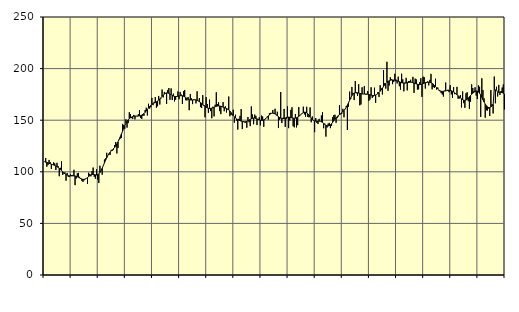
| Category | Piggar | Series 1 |
|---|---|---|
| nan | 110 | 109.69 |
| 87.0 | 113.3 | 109.31 |
| 87.0 | 104.9 | 109.14 |
| 87.0 | 106.5 | 108.66 |
| 87.0 | 111.5 | 108.25 |
| 87.0 | 109.3 | 107.81 |
| 87.0 | 102.8 | 107.39 |
| 87.0 | 107.2 | 106.99 |
| 87.0 | 109.1 | 106.58 |
| 87.0 | 108.2 | 106.17 |
| 87.0 | 101.7 | 105.67 |
| 87.0 | 108.7 | 105.05 |
| nan | 105.5 | 104.28 |
| 88.0 | 95.7 | 103.35 |
| 88.0 | 103.9 | 102.3 |
| 88.0 | 110.1 | 101.17 |
| 88.0 | 96.9 | 100.05 |
| 88.0 | 98.2 | 99.02 |
| 88.0 | 99.5 | 98.13 |
| 88.0 | 91.4 | 97.4 |
| 88.0 | 98.9 | 96.8 |
| 88.0 | 95.2 | 96.35 |
| 88.0 | 95 | 96.08 |
| 88.0 | 97.5 | 95.99 |
| nan | 96.8 | 96 |
| 89.0 | 97 | 96.06 |
| 89.0 | 101.9 | 96.09 |
| 89.0 | 87.1 | 95.98 |
| 89.0 | 93.5 | 95.68 |
| 89.0 | 98.5 | 95.24 |
| 89.0 | 98.9 | 94.67 |
| 89.0 | 95.1 | 94.05 |
| 89.0 | 94 | 93.43 |
| 89.0 | 91.3 | 92.92 |
| 89.0 | 90.2 | 92.65 |
| 89.0 | 91.8 | 92.66 |
| nan | 93.2 | 92.97 |
| 90.0 | 93.7 | 93.6 |
| 90.0 | 88.2 | 94.44 |
| 90.0 | 99.1 | 95.36 |
| 90.0 | 97.9 | 96.26 |
| 90.0 | 95.6 | 96.98 |
| 90.0 | 100.7 | 97.37 |
| 90.0 | 104.1 | 97.44 |
| 90.0 | 95.2 | 97.27 |
| 90.0 | 93.4 | 97.02 |
| 90.0 | 102.5 | 96.93 |
| 90.0 | 92.4 | 97.18 |
| nan | 89.1 | 97.92 |
| 91.0 | 105.9 | 99.22 |
| 91.0 | 100.7 | 101.09 |
| 91.0 | 97.2 | 103.42 |
| 91.0 | 105.7 | 105.98 |
| 91.0 | 111.9 | 108.64 |
| 91.0 | 113.1 | 111.24 |
| 91.0 | 118.4 | 113.63 |
| 91.0 | 115.6 | 115.73 |
| 91.0 | 116.9 | 117.53 |
| 91.0 | 116.3 | 119.01 |
| 91.0 | 121.3 | 120.2 |
| nan | 120.4 | 121.29 |
| 92.0 | 121.4 | 122.36 |
| 92.0 | 125.9 | 123.57 |
| 92.0 | 128.9 | 125.08 |
| 92.0 | 117.8 | 126.91 |
| 92.0 | 123.1 | 128.99 |
| 92.0 | 130.9 | 131.31 |
| 92.0 | 132.2 | 133.83 |
| 92.0 | 132.9 | 136.5 |
| 92.0 | 146.4 | 139.25 |
| 92.0 | 145.4 | 141.99 |
| 92.0 | 141.6 | 144.59 |
| nan | 150.9 | 146.9 |
| 93.0 | 142.8 | 148.83 |
| 93.0 | 147.2 | 150.36 |
| 93.0 | 157.7 | 151.51 |
| 93.0 | 155.8 | 152.37 |
| 93.0 | 152 | 153.02 |
| 93.0 | 151.3 | 153.5 |
| 93.0 | 155.1 | 153.79 |
| 93.0 | 150.8 | 153.97 |
| 93.0 | 154.1 | 154.03 |
| 93.0 | 153.6 | 154.02 |
| 93.0 | 155.8 | 154.05 |
| nan | 159.7 | 154.18 |
| 94.0 | 152.1 | 154.46 |
| 94.0 | 151.2 | 154.95 |
| 94.0 | 154.3 | 155.61 |
| 94.0 | 154.4 | 156.47 |
| 94.0 | 159.9 | 157.58 |
| 94.0 | 162.1 | 158.9 |
| 94.0 | 154.6 | 160.36 |
| 94.0 | 165.9 | 161.85 |
| 94.0 | 161.3 | 163.23 |
| 94.0 | 162.6 | 164.41 |
| 94.0 | 171.6 | 165.34 |
| nan | 164.6 | 166.05 |
| 95.0 | 167.8 | 166.64 |
| 95.0 | 172.4 | 167.22 |
| 95.0 | 162.1 | 167.85 |
| 95.0 | 163.5 | 168.61 |
| 95.0 | 173.5 | 169.51 |
| 95.0 | 165.2 | 170.56 |
| 95.0 | 171 | 171.75 |
| 95.0 | 179.7 | 173.03 |
| 95.0 | 172.1 | 174.28 |
| 95.0 | 177.4 | 175.36 |
| 95.0 | 175.8 | 176.12 |
| nan | 165.8 | 176.46 |
| 96.0 | 179.3 | 176.4 |
| 96.0 | 181.2 | 175.98 |
| 96.0 | 169.8 | 175.37 |
| 96.0 | 180.8 | 174.71 |
| 96.0 | 169.6 | 174.04 |
| 96.0 | 175.7 | 173.46 |
| 96.0 | 168.2 | 173.09 |
| 96.0 | 169.8 | 172.92 |
| 96.0 | 173.3 | 172.98 |
| 96.0 | 177.9 | 173.2 |
| 96.0 | 170.3 | 173.47 |
| nan | 177.4 | 173.7 |
| 97.0 | 174.9 | 173.78 |
| 97.0 | 165.7 | 173.62 |
| 97.0 | 178.2 | 173.23 |
| 97.0 | 179.3 | 172.62 |
| 97.0 | 169.3 | 171.84 |
| 97.0 | 169.2 | 171.04 |
| 97.0 | 172.5 | 170.33 |
| 97.0 | 159.7 | 169.86 |
| 97.0 | 175.4 | 169.6 |
| 97.0 | 171.1 | 169.52 |
| 97.0 | 165.6 | 169.61 |
| nan | 170.3 | 169.74 |
| 98.0 | 170 | 169.78 |
| 98.0 | 166.3 | 169.68 |
| 98.0 | 178 | 169.33 |
| 98.0 | 168.5 | 168.71 |
| 98.0 | 171.5 | 167.92 |
| 98.0 | 162.7 | 167.06 |
| 98.0 | 161.8 | 166.2 |
| 98.0 | 174.3 | 165.35 |
| 98.0 | 163.7 | 164.47 |
| 98.0 | 152.8 | 163.54 |
| 98.0 | 172.3 | 162.66 |
| nan | 165.7 | 161.95 |
| 99.0 | 157.2 | 161.52 |
| 99.0 | 169.9 | 161.37 |
| 99.0 | 158.8 | 161.44 |
| 99.0 | 151.9 | 161.66 |
| 99.0 | 163.1 | 162.03 |
| 99.0 | 153.7 | 162.5 |
| 99.0 | 165 | 163.03 |
| 99.0 | 177 | 163.44 |
| 99.0 | 165.6 | 163.7 |
| 99.0 | 167.4 | 163.82 |
| 99.0 | 158.8 | 163.78 |
| nan | 155.9 | 163.52 |
| 0.0 | 163.2 | 163.13 |
| 0.0 | 167.5 | 162.66 |
| 0.0 | 158.7 | 162.16 |
| 0.0 | 163.4 | 161.73 |
| 0.0 | 157.5 | 161.34 |
| 0.0 | 160.4 | 160.82 |
| 0.0 | 172.9 | 160.01 |
| 0.0 | 153.8 | 158.86 |
| 0.0 | 155.1 | 157.44 |
| 0.0 | 154.9 | 155.93 |
| 0.0 | 160.1 | 154.46 |
| nan | 147.6 | 153.18 |
| 1.0 | 155.3 | 152.12 |
| 1.0 | 149.6 | 151.25 |
| 1.0 | 140.9 | 150.58 |
| 1.0 | 151.4 | 150.04 |
| 1.0 | 154.2 | 149.56 |
| 1.0 | 160.8 | 149.16 |
| 1.0 | 141.4 | 148.8 |
| 1.0 | 149.1 | 148.51 |
| 1.0 | 147.9 | 148.44 |
| 1.0 | 147.5 | 148.58 |
| 1.0 | 142.7 | 148.91 |
| nan | 153.1 | 149.42 |
| 2.0 | 148 | 150.06 |
| 2.0 | 144.3 | 150.72 |
| 2.0 | 163.3 | 151.37 |
| 2.0 | 155.5 | 151.89 |
| 2.0 | 146.1 | 152.13 |
| 2.0 | 155.4 | 152.06 |
| 2.0 | 154.2 | 151.73 |
| 2.0 | 145.3 | 151.26 |
| 2.0 | 150.4 | 150.72 |
| 2.0 | 152.8 | 150.22 |
| 2.0 | 145 | 149.87 |
| nan | 154.5 | 149.76 |
| 3.0 | 153.6 | 149.89 |
| 3.0 | 143.6 | 150.3 |
| 3.0 | 150.7 | 150.96 |
| 3.0 | 152.1 | 151.83 |
| 3.0 | 153.4 | 152.92 |
| 3.0 | 150.6 | 154.09 |
| 3.0 | 156.8 | 155.19 |
| 3.0 | 157.1 | 156.11 |
| 3.0 | 156.4 | 156.69 |
| 3.0 | 159.9 | 156.87 |
| 3.0 | 156.2 | 156.67 |
| nan | 161.1 | 156.09 |
| 4.0 | 154.9 | 155.23 |
| 4.0 | 158.2 | 154.3 |
| 4.0 | 142.4 | 153.41 |
| 4.0 | 150.4 | 152.57 |
| 4.0 | 177.3 | 151.94 |
| 4.0 | 147.2 | 151.6 |
| 4.0 | 152.4 | 151.54 |
| 4.0 | 160.9 | 151.75 |
| 4.0 | 143.5 | 152.16 |
| 4.0 | 151.3 | 152.6 |
| 4.0 | 163.4 | 152.9 |
| nan | 142.3 | 153 |
| 5.0 | 149.7 | 152.88 |
| 5.0 | 160 | 152.6 |
| 5.0 | 162.5 | 152.27 |
| 5.0 | 144.2 | 152.04 |
| 5.0 | 143.1 | 151.94 |
| 5.0 | 156 | 152.03 |
| 5.0 | 143 | 152.4 |
| 5.0 | 145.2 | 152.97 |
| 5.0 | 162.7 | 153.74 |
| 5.0 | 155 | 154.69 |
| 5.0 | 155.6 | 155.66 |
| nan | 156.3 | 156.59 |
| 6.0 | 163.1 | 157.37 |
| 6.0 | 155.6 | 157.76 |
| 6.0 | 153.3 | 157.67 |
| 6.0 | 163 | 157.11 |
| 6.0 | 153.1 | 156.18 |
| 6.0 | 152.8 | 154.92 |
| 6.0 | 162.4 | 153.47 |
| 6.0 | 148 | 152.05 |
| 6.0 | 153.6 | 150.79 |
| 6.0 | 150 | 149.83 |
| 6.0 | 138.4 | 149.27 |
| nan | 152.1 | 149.03 |
| 7.0 | 147.4 | 148.99 |
| 7.0 | 146.3 | 149.04 |
| 7.0 | 151.3 | 149.06 |
| 7.0 | 148.9 | 148.91 |
| 7.0 | 154.7 | 148.46 |
| 7.0 | 157.7 | 147.75 |
| 7.0 | 142.2 | 146.86 |
| 7.0 | 146.7 | 145.92 |
| 7.0 | 134.1 | 145.14 |
| 7.0 | 142.9 | 144.59 |
| 7.0 | 146.7 | 144.43 |
| nan | 147.4 | 144.74 |
| 8.0 | 142.3 | 145.47 |
| 8.0 | 144.4 | 146.62 |
| 8.0 | 152.9 | 148.05 |
| 8.0 | 154.9 | 149.57 |
| 8.0 | 155.3 | 151.02 |
| 8.0 | 147.5 | 152.32 |
| 8.0 | 152 | 153.44 |
| 8.0 | 153.6 | 154.48 |
| 8.0 | 164.5 | 155.41 |
| 8.0 | 155.6 | 156.31 |
| 8.0 | 156 | 157.23 |
| nan | 161 | 158.23 |
| 9.0 | 152.8 | 159.41 |
| 9.0 | 160.7 | 160.87 |
| 9.0 | 163.7 | 162.59 |
| 9.0 | 140.5 | 164.6 |
| 9.0 | 163.2 | 166.92 |
| 9.0 | 177.7 | 169.38 |
| 9.0 | 170.6 | 171.76 |
| 9.0 | 182.2 | 173.79 |
| 9.0 | 176.5 | 175.3 |
| 9.0 | 169.5 | 176.24 |
| 9.0 | 187.9 | 176.68 |
| nan | 176 | 176.74 |
| 10.0 | 173.6 | 176.57 |
| 10.0 | 184.9 | 176.28 |
| 10.0 | 164.4 | 175.94 |
| 10.0 | 165.3 | 175.65 |
| 10.0 | 181.9 | 175.44 |
| 10.0 | 175.3 | 175.37 |
| 10.0 | 183 | 175.38 |
| 10.0 | 175 | 175.39 |
| 10.0 | 174.9 | 175.35 |
| 10.0 | 178.3 | 175.22 |
| 10.0 | 168.7 | 174.95 |
| nan | 170 | 174.57 |
| 11.0 | 181.9 | 174.23 |
| 11.0 | 171.5 | 173.99 |
| 11.0 | 173 | 173.94 |
| 11.0 | 181.5 | 174.09 |
| 11.0 | 166.8 | 174.44 |
| 11.0 | 175 | 175 |
| 11.0 | 177.3 | 175.79 |
| 11.0 | 172.5 | 176.8 |
| 11.0 | 183.9 | 178.05 |
| 11.0 | 180.7 | 179.51 |
| 11.0 | 174.9 | 181.08 |
| nan | 198.5 | 182.67 |
| 12.0 | 185.9 | 184.17 |
| 12.0 | 180.6 | 185.47 |
| 12.0 | 206.6 | 186.59 |
| 12.0 | 178.5 | 187.53 |
| 12.0 | 183.6 | 188.22 |
| 12.0 | 191.6 | 188.68 |
| 12.0 | 189.6 | 188.93 |
| 12.0 | 184.9 | 188.99 |
| 12.0 | 187 | 188.89 |
| 12.0 | 195 | 188.68 |
| 12.0 | 189.4 | 188.41 |
| nan | 185.6 | 188.12 |
| 13.0 | 192.2 | 187.75 |
| 13.0 | 182.9 | 187.31 |
| 13.0 | 179.6 | 186.8 |
| 13.0 | 195.1 | 186.33 |
| 13.0 | 189.6 | 186.04 |
| 13.0 | 178 | 185.9 |
| 13.0 | 186.5 | 185.91 |
| 13.0 | 191 | 186.09 |
| 13.0 | 178.9 | 186.36 |
| 13.0 | 188 | 186.59 |
| 13.0 | 187.7 | 186.75 |
| nan | 189.2 | 186.79 |
| 14.0 | 186.9 | 186.66 |
| 14.0 | 192 | 186.38 |
| 14.0 | 176.5 | 186.02 |
| 14.0 | 190.3 | 185.6 |
| 14.0 | 189.5 | 185.16 |
| 14.0 | 179.6 | 184.81 |
| 14.0 | 179.9 | 184.57 |
| 14.0 | 186.8 | 184.49 |
| 14.0 | 190.7 | 184.62 |
| 14.0 | 172.6 | 184.97 |
| 14.0 | 192.2 | 185.42 |
| nan | 191.7 | 185.88 |
| 15.0 | 180.7 | 186.3 |
| 15.0 | 186 | 186.61 |
| 15.0 | 187.6 | 186.78 |
| 15.0 | 183.7 | 186.81 |
| 15.0 | 189.1 | 186.62 |
| 15.0 | 194.9 | 186.26 |
| 15.0 | 179.9 | 185.71 |
| 15.0 | 182.1 | 184.92 |
| 15.0 | 181.3 | 183.87 |
| 15.0 | 190.2 | 182.67 |
| 15.0 | 179.6 | 181.44 |
| nan | 181.7 | 180.22 |
| 16.0 | 178.9 | 179.18 |
| 16.0 | 178 | 178.46 |
| 16.0 | 176.2 | 178.05 |
| 16.0 | 174.9 | 177.92 |
| 16.0 | 172.9 | 178.01 |
| 16.0 | 178.6 | 178.19 |
| 16.0 | 186.5 | 178.42 |
| 16.0 | 178.7 | 178.7 |
| 16.0 | 179.5 | 178.9 |
| 16.0 | 177.1 | 178.98 |
| 16.0 | 183.8 | 178.85 |
| nan | 175 | 178.51 |
| 17.0 | 171.6 | 178 |
| 17.0 | 182.1 | 177.34 |
| 17.0 | 175.2 | 176.49 |
| 17.0 | 175.6 | 175.55 |
| 17.0 | 182.3 | 174.6 |
| 17.0 | 170.8 | 173.68 |
| 17.0 | 171 | 172.71 |
| 17.0 | 174.3 | 171.69 |
| 17.0 | 162.3 | 170.72 |
| 17.0 | 177.9 | 169.88 |
| 17.0 | 166.5 | 169.34 |
| nan | 162 | 169.22 |
| 18.0 | 176.1 | 169.55 |
| 18.0 | 177.1 | 170.27 |
| 18.0 | 168.4 | 171.36 |
| 18.0 | 161 | 172.64 |
| 18.0 | 167.9 | 173.92 |
| 18.0 | 184.7 | 175.09 |
| 18.0 | 181.2 | 176.19 |
| 18.0 | 178.2 | 177.16 |
| 18.0 | 181.9 | 177.9 |
| 18.0 | 173.8 | 178.29 |
| 18.0 | 170.5 | 178.2 |
| nan | 183.8 | 177.5 |
| 19.0 | 182.4 | 176.16 |
| 19.0 | 153.1 | 174.28 |
| 19.0 | 190.6 | 172.04 |
| 19.0 | 179.2 | 169.76 |
| 19.0 | 171.2 | 167.62 |
| 19.0 | 152.4 | 165.7 |
| 19.0 | 159.6 | 164.08 |
| 19.0 | 159.4 | 162.92 |
| 19.0 | 161.3 | 162.33 |
| 19.0 | 154.1 | 162.3 |
| 19.0 | 179.2 | 162.81 |
| nan | 165.6 | 163.78 |
| 20.0 | 156.5 | 165.06 |
| 20.0 | 192.3 | 181.2 |
| 20.0 | 166.4 | 178.48 |
| 20.0 | 182.4 | 179.46 |
| 20.0 | 173 | 176.76 |
| 20.0 | 184.2 | 177.1 |
| 20.0 | 174.5 | 177.22 |
| 20.0 | 178.3 | 177.08 |
| 20.0 | 181.7 | 176.72 |
| 20.0 | 184.7 | 176.17 |
| 20.0 | 160.5 | 175.49 |